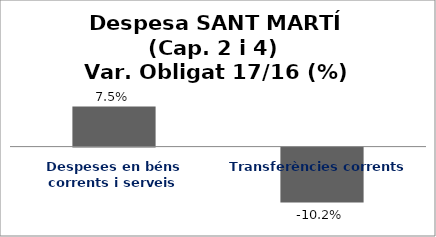
| Category | Series 0 |
|---|---|
| Despeses en béns corrents i serveis | 0.075 |
| Transferències corrents | -0.102 |